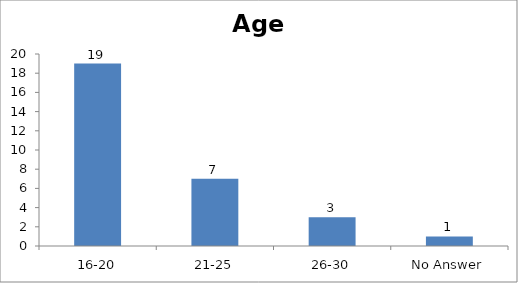
| Category | Age |
|---|---|
| 16-20 | 19 |
| 21-25 | 7 |
| 26-30 | 3 |
| No Answer | 1 |